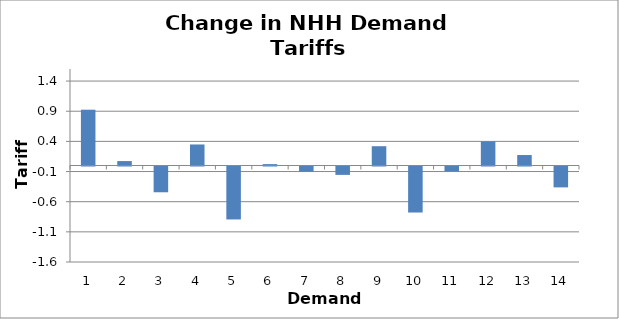
| Category | Change (p/kWh) |
|---|---|
| 0 | 0.925 |
| 1 | 0.074 |
| 2 | -0.427 |
| 3 | 0.349 |
| 4 | -0.878 |
| 5 | 0.023 |
| 6 | -0.085 |
| 7 | -0.139 |
| 8 | 0.32 |
| 9 | -0.763 |
| 10 | -0.083 |
| 11 | 0.401 |
| 12 | 0.174 |
| 13 | -0.346 |